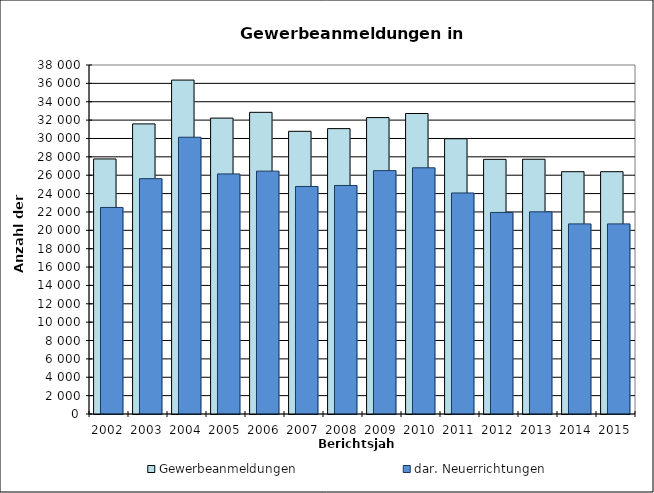
| Category | Gewerbeanmeldungen | dar. Neuerrichtungen |
|---|---|---|
| 2002.0 | 27771 | 22491 |
| 2003.0 | 31587 | 25624 |
| 2004.0 | 36359 | 30135 |
| 2005.0 | 32219 | 26140 |
| 2006.0 | 32847 | 26444 |
| 2007.0 | 30781 | 24775 |
| 2008.0 | 31074 | 24884 |
| 2009.0 | 32271 | 26499 |
| 2010.0 | 32718 | 26806 |
| 2011.0 | 29971 | 24066 |
| 2012.0 | 27728 | 21948 |
| 2013.0 | 27739 | 22013 |
| 2014.0 | 26383 | 20698 |
| 2015.0 | 26383 | 20698 |